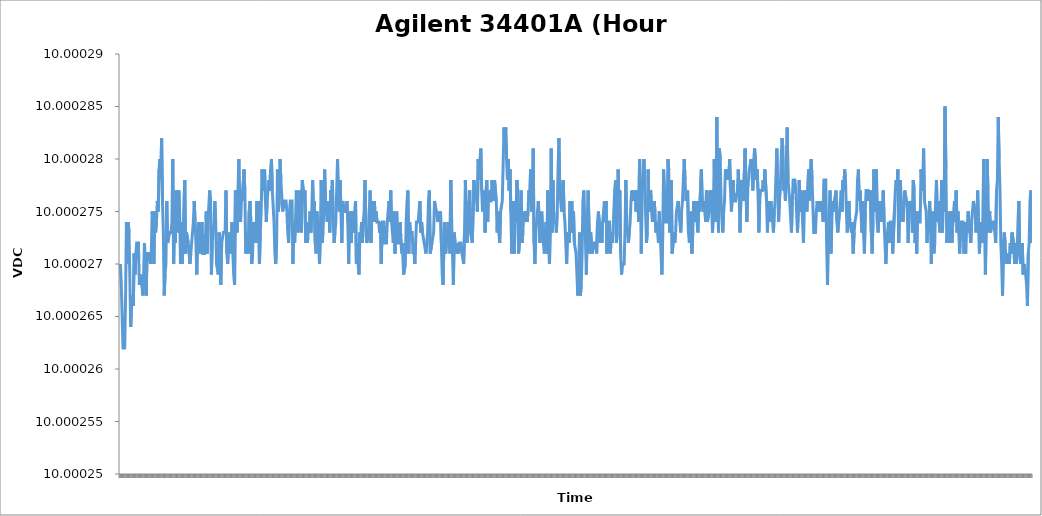
| Category | Channel 1 (VDC) |
|---|---|
| 0 | 10 |
| 1 | 10 |
| 2 | 10 |
| 3 | 10 |
| 4 | 10 |
| 5 | 10 |
| 6 | 10 |
| 7 | 10 |
| 8 | 10 |
| 9 | 10 |
| 10 | 10 |
| 11 | 10 |
| 12 | 10 |
| 13 | 10 |
| 14 | 10 |
| 15 | 10 |
| 16 | 10 |
| 17 | 10 |
| 18 | 10 |
| 19 | 10 |
| 20 | 10 |
| 21 | 10 |
| 22 | 10 |
| 23 | 10 |
| 24 | 10 |
| 25 | 10 |
| 26 | 10 |
| 27 | 10 |
| 28 | 10 |
| 29 | 10 |
| 30 | 10 |
| 31 | 10 |
| 32 | 10 |
| 33 | 10 |
| 34 | 10 |
| 35 | 10 |
| 36 | 10 |
| 37 | 10 |
| 38 | 10 |
| 39 | 10 |
| 40 | 10 |
| 41 | 10 |
| 42 | 10 |
| 43 | 10 |
| 44 | 10 |
| 45 | 10 |
| 46 | 10 |
| 47 | 10 |
| 48 | 10 |
| 49 | 10 |
| 50 | 10 |
| 51 | 10 |
| 52 | 10 |
| 53 | 10 |
| 54 | 10 |
| 55 | 10 |
| 56 | 10 |
| 57 | 10 |
| 58 | 10 |
| 59 | 10 |
| 60 | 10 |
| 61 | 10 |
| 62 | 10 |
| 63 | 10 |
| 64 | 10 |
| 65 | 10 |
| 66 | 10 |
| 67 | 10 |
| 68 | 10 |
| 69 | 10 |
| 70 | 10 |
| 71 | 10 |
| 72 | 10 |
| 73 | 10 |
| 74 | 10 |
| 75 | 10 |
| 76 | 10 |
| 77 | 10 |
| 78 | 10 |
| 79 | 10 |
| 80 | 10 |
| 81 | 10 |
| 82 | 10 |
| 83 | 10 |
| 84 | 10 |
| 85 | 10 |
| 86 | 10 |
| 87 | 10 |
| 88 | 10 |
| 89 | 10 |
| 90 | 10 |
| 91 | 10 |
| 92 | 10 |
| 93 | 10 |
| 94 | 10 |
| 95 | 10 |
| 96 | 10 |
| 97 | 10 |
| 98 | 10 |
| 99 | 10 |
| 100 | 10 |
| 101 | 10 |
| 102 | 10 |
| 103 | 10 |
| 104 | 10 |
| 105 | 10 |
| 106 | 10 |
| 107 | 10 |
| 108 | 10 |
| 109 | 10 |
| 110 | 10 |
| 111 | 10 |
| 112 | 10 |
| 113 | 10 |
| 114 | 10 |
| 115 | 10 |
| 116 | 10 |
| 117 | 10 |
| 118 | 10 |
| 119 | 10 |
| 120 | 10 |
| 121 | 10 |
| 122 | 10 |
| 123 | 10 |
| 124 | 10 |
| 125 | 10 |
| 126 | 10 |
| 127 | 10 |
| 128 | 10 |
| 129 | 10 |
| 130 | 10 |
| 131 | 10 |
| 132 | 10 |
| 133 | 10 |
| 134 | 10 |
| 135 | 10 |
| 136 | 10 |
| 137 | 10 |
| 138 | 10 |
| 139 | 10 |
| 140 | 10 |
| 141 | 10 |
| 142 | 10 |
| 143 | 10 |
| 144 | 10 |
| 145 | 10 |
| 146 | 10 |
| 147 | 10 |
| 148 | 10 |
| 149 | 10 |
| 150 | 10 |
| 151 | 10 |
| 152 | 10 |
| 153 | 10 |
| 154 | 10 |
| 155 | 10 |
| 156 | 10 |
| 157 | 10 |
| 158 | 10 |
| 159 | 10 |
| 160 | 10 |
| 161 | 10 |
| 162 | 10 |
| 163 | 10 |
| 164 | 10 |
| 165 | 10 |
| 166 | 10 |
| 167 | 10 |
| 168 | 10 |
| 169 | 10 |
| 170 | 10 |
| 171 | 10 |
| 172 | 10 |
| 173 | 10 |
| 174 | 10 |
| 175 | 10 |
| 176 | 10 |
| 177 | 10 |
| 178 | 10 |
| 179 | 10 |
| 180 | 10 |
| 181 | 10 |
| 182 | 10 |
| 183 | 10 |
| 184 | 10 |
| 185 | 10 |
| 186 | 10 |
| 187 | 10 |
| 188 | 10 |
| 189 | 10 |
| 190 | 10 |
| 191 | 10 |
| 192 | 10 |
| 193 | 10 |
| 194 | 10 |
| 195 | 10 |
| 196 | 10 |
| 197 | 10 |
| 198 | 10 |
| 199 | 10 |
| 200 | 10 |
| 201 | 10 |
| 202 | 10 |
| 203 | 10 |
| 204 | 10 |
| 205 | 10 |
| 206 | 10 |
| 207 | 10 |
| 208 | 10 |
| 209 | 10 |
| 210 | 10 |
| 211 | 10 |
| 212 | 10 |
| 213 | 10 |
| 214 | 10 |
| 215 | 10 |
| 216 | 10 |
| 217 | 10 |
| 218 | 10 |
| 219 | 10 |
| 220 | 10 |
| 221 | 10 |
| 222 | 10 |
| 223 | 10 |
| 224 | 10 |
| 225 | 10 |
| 226 | 10 |
| 227 | 10 |
| 228 | 10 |
| 229 | 10 |
| 230 | 10 |
| 231 | 10 |
| 232 | 10 |
| 233 | 10 |
| 234 | 10 |
| 235 | 10 |
| 236 | 10 |
| 237 | 10 |
| 238 | 10 |
| 239 | 10 |
| 240 | 10 |
| 241 | 10 |
| 242 | 10 |
| 243 | 10 |
| 244 | 10 |
| 245 | 10 |
| 246 | 10 |
| 247 | 10 |
| 248 | 10 |
| 249 | 10 |
| 250 | 10 |
| 251 | 10 |
| 252 | 10 |
| 253 | 10 |
| 254 | 10 |
| 255 | 10 |
| 256 | 10 |
| 257 | 10 |
| 258 | 10 |
| 259 | 10 |
| 260 | 10 |
| 261 | 10 |
| 262 | 10 |
| 263 | 10 |
| 264 | 10 |
| 265 | 10 |
| 266 | 10 |
| 267 | 10 |
| 268 | 10 |
| 269 | 10 |
| 270 | 10 |
| 271 | 10 |
| 272 | 10 |
| 273 | 10 |
| 274 | 10 |
| 275 | 10 |
| 276 | 10 |
| 277 | 10 |
| 278 | 10 |
| 279 | 10 |
| 280 | 10 |
| 281 | 10 |
| 282 | 10 |
| 283 | 10 |
| 284 | 10 |
| 285 | 10 |
| 286 | 10 |
| 287 | 10 |
| 288 | 10 |
| 289 | 10 |
| 290 | 10 |
| 291 | 10 |
| 292 | 10 |
| 293 | 10 |
| 294 | 10 |
| 295 | 10 |
| 296 | 10 |
| 297 | 10 |
| 298 | 10 |
| 299 | 10 |
| 300 | 10 |
| 301 | 10 |
| 302 | 10 |
| 303 | 10 |
| 304 | 10 |
| 305 | 10 |
| 306 | 10 |
| 307 | 10 |
| 308 | 10 |
| 309 | 10 |
| 310 | 10 |
| 311 | 10 |
| 312 | 10 |
| 313 | 10 |
| 314 | 10 |
| 315 | 10 |
| 316 | 10 |
| 317 | 10 |
| 318 | 10 |
| 319 | 10 |
| 320 | 10 |
| 321 | 10 |
| 322 | 10 |
| 323 | 10 |
| 324 | 10 |
| 325 | 10 |
| 326 | 10 |
| 327 | 10 |
| 328 | 10 |
| 329 | 10 |
| 330 | 10 |
| 331 | 10 |
| 332 | 10 |
| 333 | 10 |
| 334 | 10 |
| 335 | 10 |
| 336 | 10 |
| 337 | 10 |
| 338 | 10 |
| 339 | 10 |
| 340 | 10 |
| 341 | 10 |
| 342 | 10 |
| 343 | 10 |
| 344 | 10 |
| 345 | 10 |
| 346 | 10 |
| 347 | 10 |
| 348 | 10 |
| 349 | 10 |
| 350 | 10 |
| 351 | 10 |
| 352 | 10 |
| 353 | 10 |
| 354 | 10 |
| 355 | 10 |
| 356 | 10 |
| 357 | 10 |
| 358 | 10 |
| 359 | 10 |
| 360 | 10 |
| 361 | 10 |
| 362 | 10 |
| 363 | 10 |
| 364 | 10 |
| 365 | 10 |
| 366 | 10 |
| 367 | 10 |
| 368 | 10 |
| 369 | 10 |
| 370 | 10 |
| 371 | 10 |
| 372 | 10 |
| 373 | 10 |
| 374 | 10 |
| 375 | 10 |
| 376 | 10 |
| 377 | 10 |
| 378 | 10 |
| 379 | 10 |
| 380 | 10 |
| 381 | 10 |
| 382 | 10 |
| 383 | 10 |
| 384 | 10 |
| 385 | 10 |
| 386 | 10 |
| 387 | 10 |
| 388 | 10 |
| 389 | 10 |
| 390 | 10 |
| 391 | 10 |
| 392 | 10 |
| 393 | 10 |
| 394 | 10 |
| 395 | 10 |
| 396 | 10 |
| 397 | 10 |
| 398 | 10 |
| 399 | 10 |
| 400 | 10 |
| 401 | 10 |
| 402 | 10 |
| 403 | 10 |
| 404 | 10 |
| 405 | 10 |
| 406 | 10 |
| 407 | 10 |
| 408 | 10 |
| 409 | 10 |
| 410 | 10 |
| 411 | 10 |
| 412 | 10 |
| 413 | 10 |
| 414 | 10 |
| 415 | 10 |
| 416 | 10 |
| 417 | 10 |
| 418 | 10 |
| 419 | 10 |
| 420 | 10 |
| 421 | 10 |
| 422 | 10 |
| 423 | 10 |
| 424 | 10 |
| 425 | 10 |
| 426 | 10 |
| 427 | 10 |
| 428 | 10 |
| 429 | 10 |
| 430 | 10 |
| 431 | 10 |
| 432 | 10 |
| 433 | 10 |
| 434 | 10 |
| 435 | 10 |
| 436 | 10 |
| 437 | 10 |
| 438 | 10 |
| 439 | 10 |
| 440 | 10 |
| 441 | 10 |
| 442 | 10 |
| 443 | 10 |
| 444 | 10 |
| 445 | 10 |
| 446 | 10 |
| 447 | 10 |
| 448 | 10 |
| 449 | 10 |
| 450 | 10 |
| 451 | 10 |
| 452 | 10 |
| 453 | 10 |
| 454 | 10 |
| 455 | 10 |
| 456 | 10 |
| 457 | 10 |
| 458 | 10 |
| 459 | 10 |
| 460 | 10 |
| 461 | 10 |
| 462 | 10 |
| 463 | 10 |
| 464 | 10 |
| 465 | 10 |
| 466 | 10 |
| 467 | 10 |
| 468 | 10 |
| 469 | 10 |
| 470 | 10 |
| 471 | 10 |
| 472 | 10 |
| 473 | 10 |
| 474 | 10 |
| 475 | 10 |
| 476 | 10 |
| 477 | 10 |
| 478 | 10 |
| 479 | 10 |
| 480 | 10 |
| 481 | 10 |
| 482 | 10 |
| 483 | 10 |
| 484 | 10 |
| 485 | 10 |
| 486 | 10 |
| 487 | 10 |
| 488 | 10 |
| 489 | 10 |
| 490 | 10 |
| 491 | 10 |
| 492 | 10 |
| 493 | 10 |
| 494 | 10 |
| 495 | 10 |
| 496 | 10 |
| 497 | 10 |
| 498 | 10 |
| 499 | 10 |
| 500 | 10 |
| 501 | 10 |
| 502 | 10 |
| 503 | 10 |
| 504 | 10 |
| 505 | 10 |
| 506 | 10 |
| 507 | 10 |
| 508 | 10 |
| 509 | 10 |
| 510 | 10 |
| 511 | 10 |
| 512 | 10 |
| 513 | 10 |
| 514 | 10 |
| 515 | 10 |
| 516 | 10 |
| 517 | 10 |
| 518 | 10 |
| 519 | 10 |
| 520 | 10 |
| 521 | 10 |
| 522 | 10 |
| 523 | 10 |
| 524 | 10 |
| 525 | 10 |
| 526 | 10 |
| 527 | 10 |
| 528 | 10 |
| 529 | 10 |
| 530 | 10 |
| 531 | 10 |
| 532 | 10 |
| 533 | 10 |
| 534 | 10 |
| 535 | 10 |
| 536 | 10 |
| 537 | 10 |
| 538 | 10 |
| 539 | 10 |
| 540 | 10 |
| 541 | 10 |
| 542 | 10 |
| 543 | 10 |
| 544 | 10 |
| 545 | 10 |
| 546 | 10 |
| 547 | 10 |
| 548 | 10 |
| 549 | 10 |
| 550 | 10 |
| 551 | 10 |
| 552 | 10 |
| 553 | 10 |
| 554 | 10 |
| 555 | 10 |
| 556 | 10 |
| 557 | 10 |
| 558 | 10 |
| 559 | 10 |
| 560 | 10 |
| 561 | 10 |
| 562 | 10 |
| 563 | 10 |
| 564 | 10 |
| 565 | 10 |
| 566 | 10 |
| 567 | 10 |
| 568 | 10 |
| 569 | 10 |
| 570 | 10 |
| 571 | 10 |
| 572 | 10 |
| 573 | 10 |
| 574 | 10 |
| 575 | 10 |
| 576 | 10 |
| 577 | 10 |
| 578 | 10 |
| 579 | 10 |
| 580 | 10 |
| 581 | 10 |
| 582 | 10 |
| 583 | 10 |
| 584 | 10 |
| 585 | 10 |
| 586 | 10 |
| 587 | 10 |
| 588 | 10 |
| 589 | 10 |
| 590 | 10 |
| 591 | 10 |
| 592 | 10 |
| 593 | 10 |
| 594 | 10 |
| 595 | 10 |
| 596 | 10 |
| 597 | 10 |
| 598 | 10 |
| 599 | 10 |
| 600 | 10 |
| 601 | 10 |
| 602 | 10 |
| 603 | 10 |
| 604 | 10 |
| 605 | 10 |
| 606 | 10 |
| 607 | 10 |
| 608 | 10 |
| 609 | 10 |
| 610 | 10 |
| 611 | 10 |
| 612 | 10 |
| 613 | 10 |
| 614 | 10 |
| 615 | 10 |
| 616 | 10 |
| 617 | 10 |
| 618 | 10 |
| 619 | 10 |
| 620 | 10 |
| 621 | 10 |
| 622 | 10 |
| 623 | 10 |
| 624 | 10 |
| 625 | 10 |
| 626 | 10 |
| 627 | 10 |
| 628 | 10 |
| 629 | 10 |
| 630 | 10 |
| 631 | 10 |
| 632 | 10 |
| 633 | 10 |
| 634 | 10 |
| 635 | 10 |
| 636 | 10 |
| 637 | 10 |
| 638 | 10 |
| 639 | 10 |
| 640 | 10 |
| 641 | 10 |
| 642 | 10 |
| 643 | 10 |
| 644 | 10 |
| 645 | 10 |
| 646 | 10 |
| 647 | 10 |
| 648 | 10 |
| 649 | 10 |
| 650 | 10 |
| 651 | 10 |
| 652 | 10 |
| 653 | 10 |
| 654 | 10 |
| 655 | 10 |
| 656 | 10 |
| 657 | 10 |
| 658 | 10 |
| 659 | 10 |
| 660 | 10 |
| 661 | 10 |
| 662 | 10 |
| 663 | 10 |
| 664 | 10 |
| 665 | 10 |
| 666 | 10 |
| 667 | 10 |
| 668 | 10 |
| 669 | 10 |
| 670 | 10 |
| 671 | 10 |
| 672 | 10 |
| 673 | 10 |
| 674 | 10 |
| 675 | 10 |
| 676 | 10 |
| 677 | 10 |
| 678 | 10 |
| 679 | 10 |
| 680 | 10 |
| 681 | 10 |
| 682 | 10 |
| 683 | 10 |
| 684 | 10 |
| 685 | 10 |
| 686 | 10 |
| 687 | 10 |
| 688 | 10 |
| 689 | 10 |
| 690 | 10 |
| 691 | 10 |
| 692 | 10 |
| 693 | 10 |
| 694 | 10 |
| 695 | 10 |
| 696 | 10 |
| 697 | 10 |
| 698 | 10 |
| 699 | 10 |
| 700 | 10 |
| 701 | 10 |
| 702 | 10 |
| 703 | 10 |
| 704 | 10 |
| 705 | 10 |
| 706 | 10 |
| 707 | 10 |
| 708 | 10 |
| 709 | 10 |
| 710 | 10 |
| 711 | 10 |
| 712 | 10 |
| 713 | 10 |
| 714 | 10 |
| 715 | 10 |
| 716 | 10 |
| 717 | 10 |
| 718 | 10 |
| 719 | 10 |
| 720 | 10 |
| 721 | 10 |
| 722 | 10 |
| 723 | 10 |
| 724 | 10 |
| 725 | 10 |
| 726 | 10 |
| 727 | 10 |
| 728 | 10 |
| 729 | 10 |
| 730 | 10 |
| 731 | 10 |
| 732 | 10 |
| 733 | 10 |
| 734 | 10 |
| 735 | 10 |
| 736 | 10 |
| 737 | 10 |
| 738 | 10 |
| 739 | 10 |
| 740 | 10 |
| 741 | 10 |
| 742 | 10 |
| 743 | 10 |
| 744 | 10 |
| 745 | 10 |
| 746 | 10 |
| 747 | 10 |
| 748 | 10 |
| 749 | 10 |
| 750 | 10 |
| 751 | 10 |
| 752 | 10 |
| 753 | 10 |
| 754 | 10 |
| 755 | 10 |
| 756 | 10 |
| 757 | 10 |
| 758 | 10 |
| 759 | 10 |
| 760 | 10 |
| 761 | 10 |
| 762 | 10 |
| 763 | 10 |
| 764 | 10 |
| 765 | 10 |
| 766 | 10 |
| 767 | 10 |
| 768 | 10 |
| 769 | 10 |
| 770 | 10 |
| 771 | 10 |
| 772 | 10 |
| 773 | 10 |
| 774 | 10 |
| 775 | 10 |
| 776 | 10 |
| 777 | 10 |
| 778 | 10 |
| 779 | 10 |
| 780 | 10 |
| 781 | 10 |
| 782 | 10 |
| 783 | 10 |
| 784 | 10 |
| 785 | 10 |
| 786 | 10 |
| 787 | 10 |
| 788 | 10 |
| 789 | 10 |
| 790 | 10 |
| 791 | 10 |
| 792 | 10 |
| 793 | 10 |
| 794 | 10 |
| 795 | 10 |
| 796 | 10 |
| 797 | 10 |
| 798 | 10 |
| 799 | 10 |
| 800 | 10 |
| 801 | 10 |
| 802 | 10 |
| 803 | 10 |
| 804 | 10 |
| 805 | 10 |
| 806 | 10 |
| 807 | 10 |
| 808 | 10 |
| 809 | 10 |
| 810 | 10 |
| 811 | 10 |
| 812 | 10 |
| 813 | 10 |
| 814 | 10 |
| 815 | 10 |
| 816 | 10 |
| 817 | 10 |
| 818 | 10 |
| 819 | 10 |
| 820 | 10 |
| 821 | 10 |
| 822 | 10 |
| 823 | 10 |
| 824 | 10 |
| 825 | 10 |
| 826 | 10 |
| 827 | 10 |
| 828 | 10 |
| 829 | 10 |
| 830 | 10 |
| 831 | 10 |
| 832 | 10 |
| 833 | 10 |
| 834 | 10 |
| 835 | 10 |
| 836 | 10 |
| 837 | 10 |
| 838 | 10 |
| 839 | 10 |
| 840 | 10 |
| 841 | 10 |
| 842 | 10 |
| 843 | 10 |
| 844 | 10 |
| 845 | 10 |
| 846 | 10 |
| 847 | 10 |
| 848 | 10 |
| 849 | 10 |
| 850 | 10 |
| 851 | 10 |
| 852 | 10 |
| 853 | 10 |
| 854 | 10 |
| 855 | 10 |
| 856 | 10 |
| 857 | 10 |
| 858 | 10 |
| 859 | 10 |
| 860 | 10 |
| 861 | 10 |
| 862 | 10 |
| 863 | 10 |
| 864 | 10 |
| 865 | 10 |
| 866 | 10 |
| 867 | 10 |
| 868 | 10 |
| 869 | 10 |
| 870 | 10 |
| 871 | 10 |
| 872 | 10 |
| 873 | 10 |
| 874 | 10 |
| 875 | 10 |
| 876 | 10 |
| 877 | 10 |
| 878 | 10 |
| 879 | 10 |
| 880 | 10 |
| 881 | 10 |
| 882 | 10 |
| 883 | 10 |
| 884 | 10 |
| 885 | 10 |
| 886 | 10 |
| 887 | 10 |
| 888 | 10 |
| 889 | 10 |
| 890 | 10 |
| 891 | 10 |
| 892 | 10 |
| 893 | 10 |
| 894 | 10 |
| 895 | 10 |
| 896 | 10 |
| 897 | 10 |
| 898 | 10 |
| 899 | 10 |
| 900 | 10 |
| 901 | 10 |
| 902 | 10 |
| 903 | 10 |
| 904 | 10 |
| 905 | 10 |
| 906 | 10 |
| 907 | 10 |
| 908 | 10 |
| 909 | 10 |
| 910 | 10 |
| 911 | 10 |
| 912 | 10 |
| 913 | 10 |
| 914 | 10 |
| 915 | 10 |
| 916 | 10 |
| 917 | 10 |
| 918 | 10 |
| 919 | 10 |
| 920 | 10 |
| 921 | 10 |
| 922 | 10 |
| 923 | 10 |
| 924 | 10 |
| 925 | 10 |
| 926 | 10 |
| 927 | 10 |
| 928 | 10 |
| 929 | 10 |
| 930 | 10 |
| 931 | 10 |
| 932 | 10 |
| 933 | 10 |
| 934 | 10 |
| 935 | 10 |
| 936 | 10 |
| 937 | 10 |
| 938 | 10 |
| 939 | 10 |
| 940 | 10 |
| 941 | 10 |
| 942 | 10 |
| 943 | 10 |
| 944 | 10 |
| 945 | 10 |
| 946 | 10 |
| 947 | 10 |
| 948 | 10 |
| 949 | 10 |
| 950 | 10 |
| 951 | 10 |
| 952 | 10 |
| 953 | 10 |
| 954 | 10 |
| 955 | 10 |
| 956 | 10 |
| 957 | 10 |
| 958 | 10 |
| 959 | 10 |
| 960 | 10 |
| 961 | 10 |
| 962 | 10 |
| 963 | 10 |
| 964 | 10 |
| 965 | 10 |
| 966 | 10 |
| 967 | 10 |
| 968 | 10 |
| 969 | 10 |
| 970 | 10 |
| 971 | 10 |
| 972 | 10 |
| 973 | 10 |
| 974 | 10 |
| 975 | 10 |
| 976 | 10 |
| 977 | 10 |
| 978 | 10 |
| 979 | 10 |
| 980 | 10 |
| 981 | 10 |
| 982 | 10 |
| 983 | 10 |
| 984 | 10 |
| 985 | 10 |
| 986 | 10 |
| 987 | 10 |
| 988 | 10 |
| 989 | 10 |
| 990 | 10 |
| 991 | 10 |
| 992 | 10 |
| 993 | 10 |
| 994 | 10 |
| 995 | 10 |
| 996 | 10 |
| 997 | 10 |
| 998 | 10 |
| 999 | 10 |
| 1000 | 10 |
| 1001 | 10 |
| 1002 | 10 |
| 1003 | 10 |
| 1004 | 10 |
| 1005 | 10 |
| 1006 | 10 |
| 1007 | 10 |
| 1008 | 10 |
| 1009 | 10 |
| 1010 | 10 |
| 1011 | 10 |
| 1012 | 10 |
| 1013 | 10 |
| 1014 | 10 |
| 1015 | 10 |
| 1016 | 10 |
| 1017 | 10 |
| 1018 | 10 |
| 1019 | 10 |
| 1020 | 10 |
| 1021 | 10 |
| 1022 | 10 |
| 1023 | 10 |
| 1024 | 10 |
| 1025 | 10 |
| 1026 | 10 |
| 1027 | 10 |
| 1028 | 10 |
| 1029 | 10 |
| 1030 | 10 |
| 1031 | 10 |
| 1032 | 10 |
| 1033 | 10 |
| 1034 | 10 |
| 1035 | 10 |
| 1036 | 10 |
| 1037 | 10 |
| 1038 | 10 |
| 1039 | 10 |
| 1040 | 10 |
| 1041 | 10 |
| 1042 | 10 |
| 1043 | 10 |
| 1044 | 10 |
| 1045 | 10 |
| 1046 | 10 |
| 1047 | 10 |
| 1048 | 10 |
| 1049 | 10 |
| 1050 | 10 |
| 1051 | 10 |
| 1052 | 10 |
| 1053 | 10 |
| 1054 | 10 |
| 1055 | 10 |
| 1056 | 10 |
| 1057 | 10 |
| 1058 | 10 |
| 1059 | 10 |
| 1060 | 10 |
| 1061 | 10 |
| 1062 | 10 |
| 1063 | 10 |